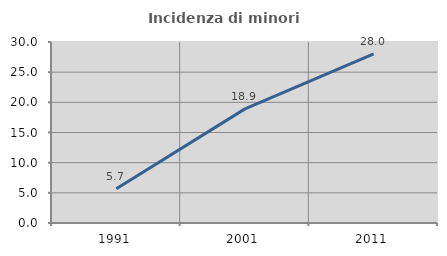
| Category | Incidenza di minori stranieri |
|---|---|
| 1991.0 | 5.66 |
| 2001.0 | 18.919 |
| 2011.0 | 28.039 |